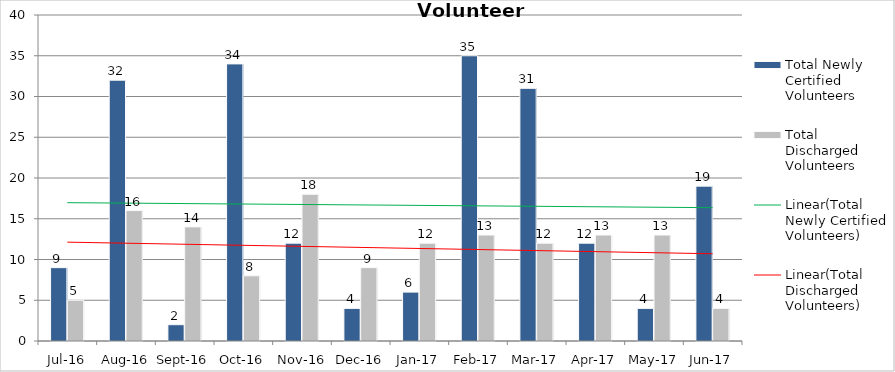
| Category | Total Newly Certified Volunteers | Total Discharged Volunteers |
|---|---|---|
| Jul-16 | 9 | 5 |
| Aug-16 | 32 | 16 |
| Sep-16 | 2 | 14 |
| Oct-16 | 34 | 8 |
| Nov-16 | 12 | 18 |
| Dec-16 | 4 | 9 |
| Jan-17 | 6 | 12 |
| Feb-17 | 35 | 13 |
| Mar-17 | 31 | 12 |
| Apr-17 | 12 | 13 |
| May-17 | 4 | 13 |
| Jun-17 | 19 | 4 |